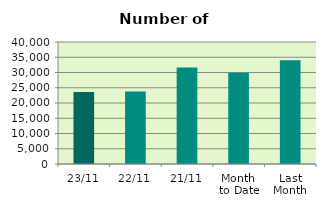
| Category | Series 0 |
|---|---|
| 23/11 | 23590 |
| 22/11 | 23764 |
| 21/11 | 31666 |
| Month 
to Date | 29902.824 |
| Last
Month | 34034.348 |